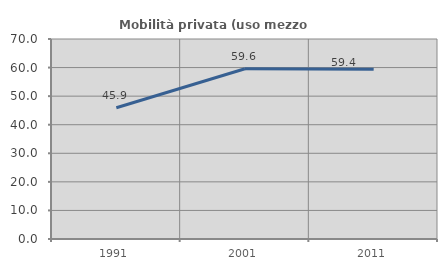
| Category | Mobilità privata (uso mezzo privato) |
|---|---|
| 1991.0 | 45.938 |
| 2001.0 | 59.6 |
| 2011.0 | 59.447 |